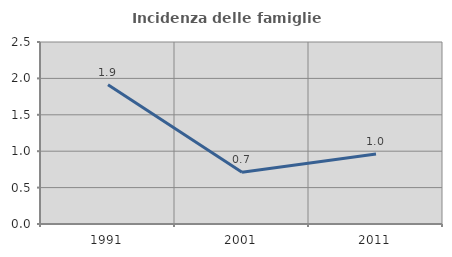
| Category | Incidenza delle famiglie numerose |
|---|---|
| 1991.0 | 1.912 |
| 2001.0 | 0.71 |
| 2011.0 | 0.962 |